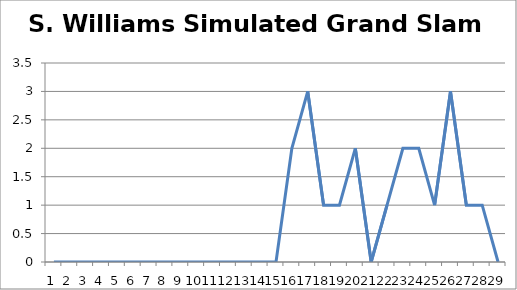
| Category | S. Williams Simulated Grand Slam Titles |
|---|---|
| 0 | 0 |
| 1 | 0 |
| 2 | 0 |
| 3 | 0 |
| 4 | 0 |
| 5 | 0 |
| 6 | 0 |
| 7 | 0 |
| 8 | 0 |
| 9 | 0 |
| 10 | 0 |
| 11 | 0 |
| 12 | 0 |
| 13 | 0 |
| 14 | 0 |
| 15 | 2 |
| 16 | 3 |
| 17 | 1 |
| 18 | 1 |
| 19 | 2 |
| 20 | 0 |
| 21 | 1 |
| 22 | 2 |
| 23 | 2 |
| 24 | 1 |
| 25 | 3 |
| 26 | 1 |
| 27 | 1 |
| 28 | 0 |